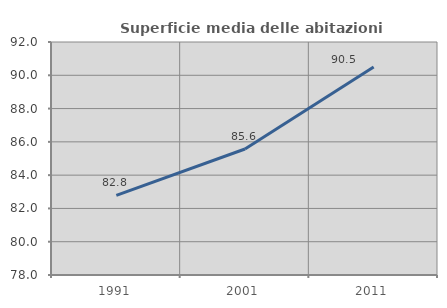
| Category | Superficie media delle abitazioni occupate |
|---|---|
| 1991.0 | 82.786 |
| 2001.0 | 85.573 |
| 2011.0 | 90.497 |